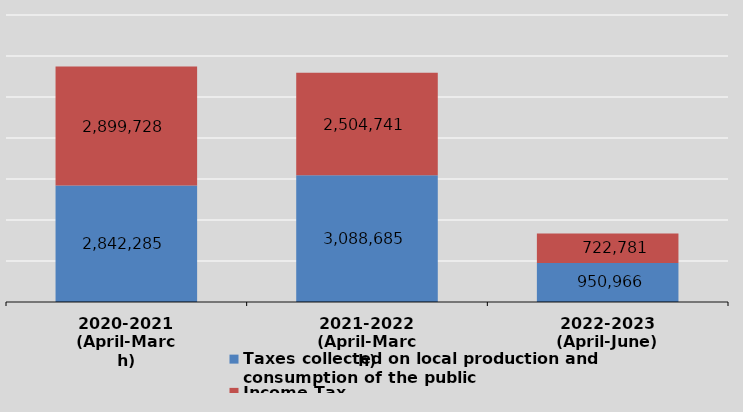
| Category | Taxes collected on local production and
consumption of the public | Income Tax   |
|---|---|---|
| 2020-2021
(April-March) | 2842285.007 | 2899728 |
| 2021-2022
(April-March) | 3088685.225 | 2504741.397 |
| 2022-2023
(April-June) | 950966 | 722781 |